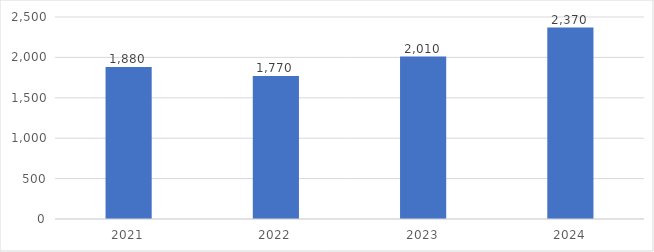
| Category | Series 0 |
|---|---|
| 2021.0 | 1880 |
| 2022.0 | 1770 |
| 2023.0 | 2010 |
| 2024.0 | 2370 |